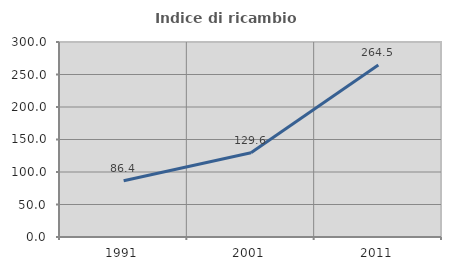
| Category | Indice di ricambio occupazionale  |
|---|---|
| 1991.0 | 86.436 |
| 2001.0 | 129.641 |
| 2011.0 | 264.477 |